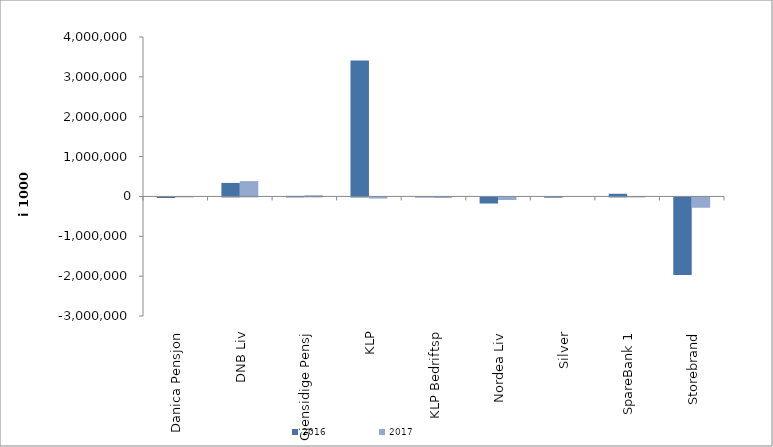
| Category | 2016 | 2017 |
|---|---|---|
| 0 | -13818.659 | 8925.642 |
| 1 | 339103 | 384120 |
| 2 | 13427.598 | 30047.581 |
| 3 | 3407665.299 | -27827.164 |
| 4 | 1186 | -13752 |
| 5 | -152886.35 | -64871.014 |
| 6 | -7054.664 | 0 |
| 7 | 66489.531 | 7266.884 |
| 8 | -1944428.414 | -259239.611 |